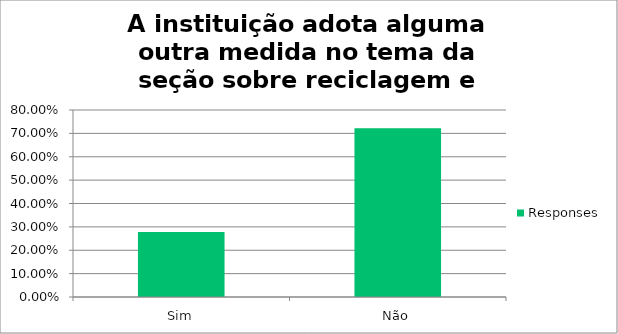
| Category | Responses |
|---|---|
| Sim | 0.278 |
| Não | 0.722 |